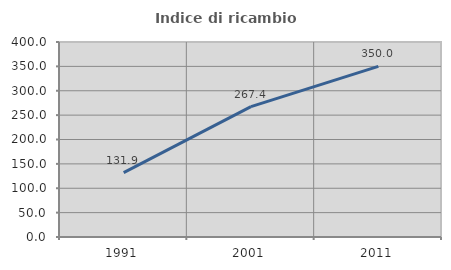
| Category | Indice di ricambio occupazionale  |
|---|---|
| 1991.0 | 131.944 |
| 2001.0 | 267.442 |
| 2011.0 | 350 |